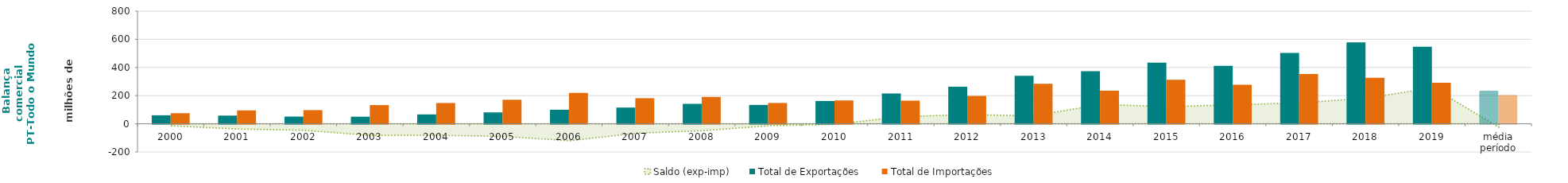
| Category | Total de Exportações  | Total de Importações  |
|---|---|---|
| 2000 | 60.474 | 75.292 |
| 2001 | 58.234 | 95.155 |
| 2002 | 51.211 | 97.136 |
| 2003 | 50.417 | 132.834 |
| 2004 | 66.729 | 147.835 |
| 2005 | 80.926 | 170.816 |
| 2006 | 99.931 | 220.039 |
| 2007 | 115.187 | 181.754 |
| 2008 | 141.826 | 190.837 |
| 2009 | 134.168 | 148.031 |
| 2010 | 161.954 | 165.794 |
| 2011 | 215.436 | 164.427 |
| 2012 | 263.032 | 198.156 |
| 2013 | 341.033 | 284.1 |
| 2014 | 372.973 | 235.023 |
| 2015 | 434.161 | 312.304 |
| 2016 | 411.746 | 277.469 |
| 2017 | 502.76 | 353.223 |
| 2018 | 578.834 | 327.015 |
| 2019 | 547.117 | 290.935 |
| média período | 234.407 | 203.409 |